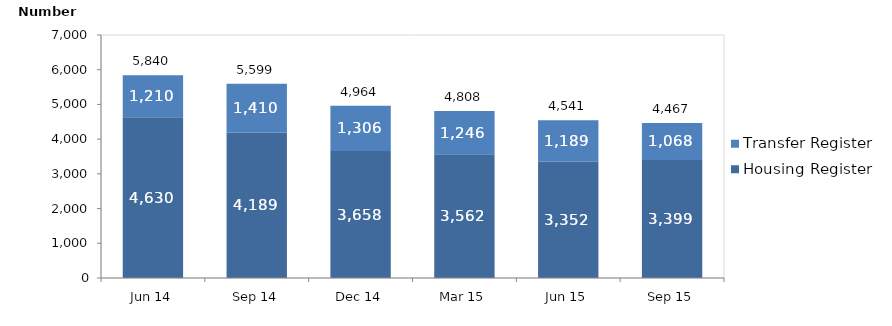
| Category | Housing Register | Transfer Register |
|---|---|---|
| Jun 14 | 4630 | 1210 |
| Sep 14 | 4189 | 1410 |
| Dec 14 | 3658 | 1306 |
| Mar 15 | 3562 | 1246 |
| Jun 15 | 3352 | 1189 |
| Sep 15 | 3399 | 1068 |